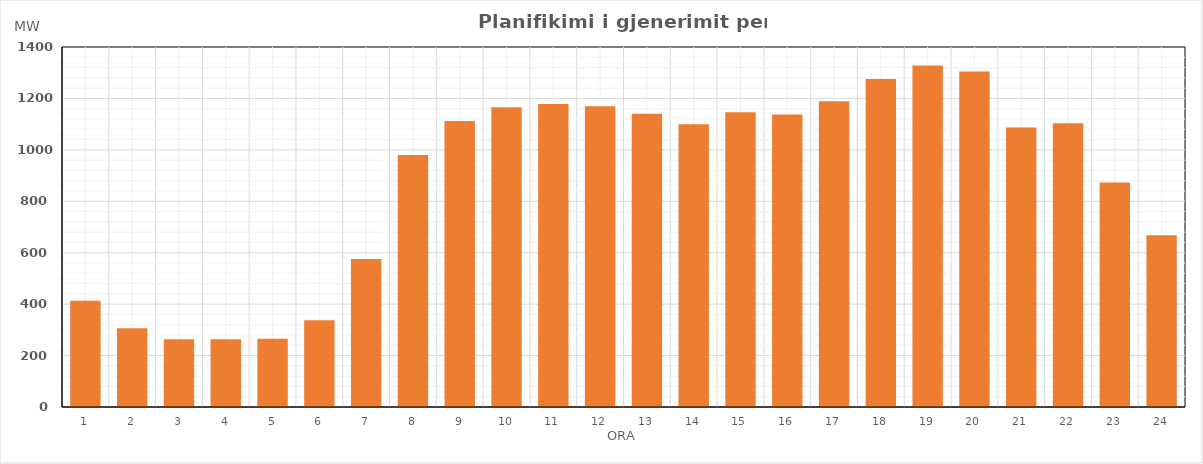
| Category | Max (MW) |
|---|---|
| 0 | 413.119 |
| 1 | 306.216 |
| 2 | 263.873 |
| 3 | 263.641 |
| 4 | 265.327 |
| 5 | 337.204 |
| 6 | 575.542 |
| 7 | 979.835 |
| 8 | 1111.915 |
| 9 | 1165.521 |
| 10 | 1178.619 |
| 11 | 1169.501 |
| 12 | 1140.472 |
| 13 | 1099.768 |
| 14 | 1146.487 |
| 15 | 1137.127 |
| 16 | 1188.964 |
| 17 | 1275.529 |
| 18 | 1327.686 |
| 19 | 1305.202 |
| 20 | 1087.142 |
| 21 | 1103.846 |
| 22 | 872.648 |
| 23 | 668.011 |